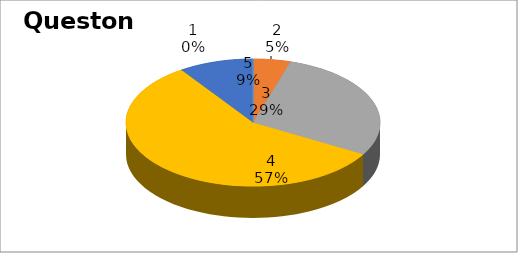
| Category | Series 0 |
|---|---|
| 0 | 0 |
| 1 | 1 |
| 2 | 6 |
| 3 | 12 |
| 4 | 2 |